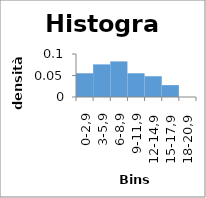
| Category | Series 0 |
|---|---|
| 0-2,9 | 0.055 |
| 3-5,9 | 0.076 |
| 6-8,9 | 0.083 |
| 9-11,9 | 0.055 |
| 12-14,9 | 0.048 |
| 15-17,9 | 0.028 |
| 18-20,9 | 0 |